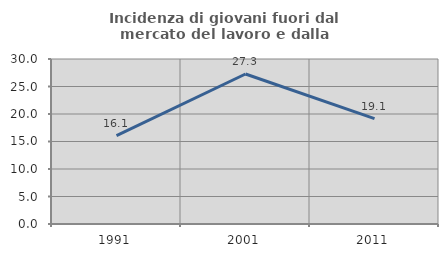
| Category | Incidenza di giovani fuori dal mercato del lavoro e dalla formazione  |
|---|---|
| 1991.0 | 16.071 |
| 2001.0 | 27.273 |
| 2011.0 | 19.149 |